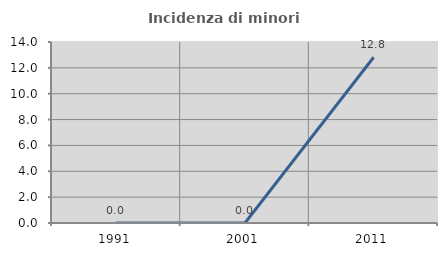
| Category | Incidenza di minori stranieri |
|---|---|
| 1991.0 | 0 |
| 2001.0 | 0 |
| 2011.0 | 12.821 |